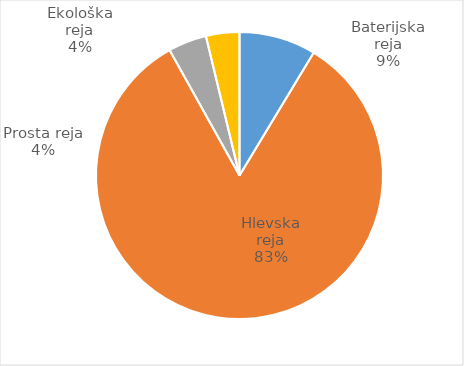
| Category | Število kosov jajc |
|---|---|
| Baterijska reja | 328386 |
| Hlevska reja | 3161776 |
| Prosta reja | 164352 |
| Ekološka reja | 143040 |